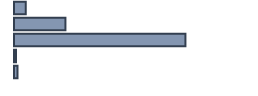
| Category | Percentatge |
|---|---|
| 0 | 4.857 |
| 1 | 21.429 |
| 2 | 71.429 |
| 3 | 0.857 |
| 4 | 1.429 |